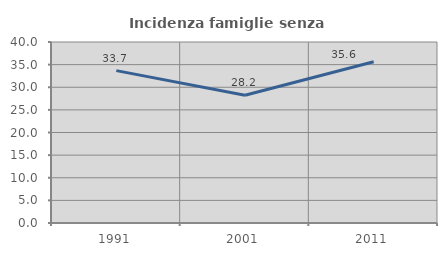
| Category | Incidenza famiglie senza nuclei |
|---|---|
| 1991.0 | 33.67 |
| 2001.0 | 28.241 |
| 2011.0 | 35.63 |